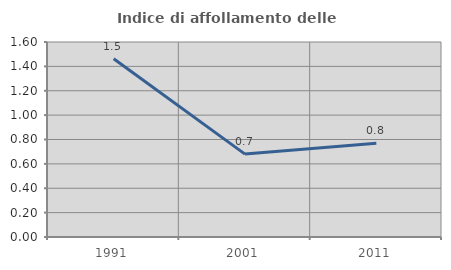
| Category | Indice di affollamento delle abitazioni  |
|---|---|
| 1991.0 | 1.462 |
| 2001.0 | 0.68 |
| 2011.0 | 0.769 |